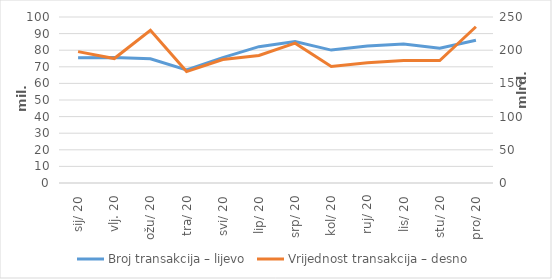
| Category | Broj transakcija – lijevo |
|---|---|
| sij. 20 | 75481532 |
| vlj. 20 | 75603317 |
| ožu. 20 | 74789970 |
| tra. 20 | 68062079 |
| svi. 20 | 75530360 |
| lip. 20 | 82137656 |
| srp. 20 | 85178442 |
| kol. 20 | 80059041 |
| ruj. 20 | 82511852 |
| lis. 20 | 83750851 |
| stu. 20 | 81246463 |
| pro. 20 | 85993154 |